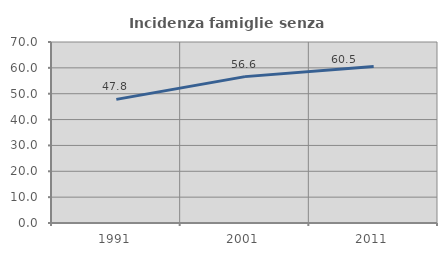
| Category | Incidenza famiglie senza nuclei |
|---|---|
| 1991.0 | 47.813 |
| 2001.0 | 56.609 |
| 2011.0 | 60.542 |